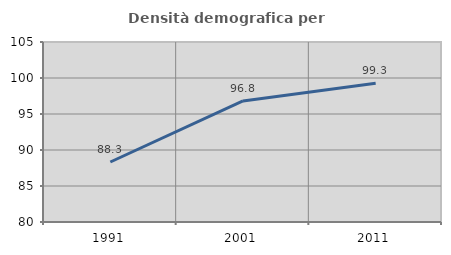
| Category | Densità demografica |
|---|---|
| 1991.0 | 88.332 |
| 2001.0 | 96.815 |
| 2011.0 | 99.277 |